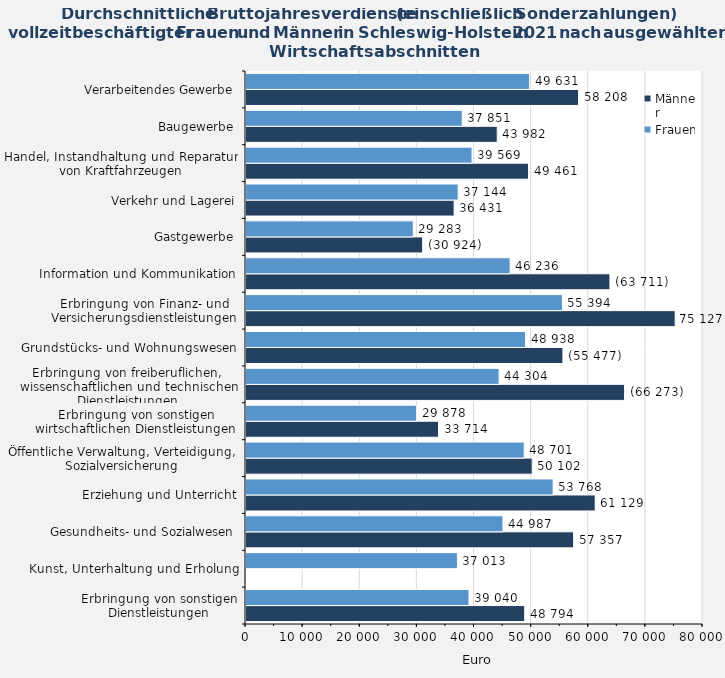
| Category | Männer | Frauen |
|---|---|---|
| Erbringung von sonstigen Dienstleistungen | 48794 | 39040 |
| Kunst, Unterhaltung und Erholung | 0 | 37013 |
| Gesundheits- und Sozialwesen | 57357 | 44987 |
| Erziehung und Unterricht | 61129 | 53768 |
| Öffentliche Verwaltung, Verteidigung, Sozialversicherung | 50102 | 48701 |
| Erbringung von sonstigen wirtschaftlichen Dienstleistungen | 33714 | 29878 |
| Erbringung von freiberuflichen, 
wissenschaftlichen und technischen Dienstleistungen | 66273 | 44304 |
| Grundstücks- und Wohnungswesen | 55477 | 48938 |
| Erbringung von Finanz- und Versicherungsdienstleistungen | 75127 | 55394 |
| Information und Kommunikation | 63711 | 46236 |
| Gastgewerbe | 30924 | 29283 |
| Verkehr und Lagerei | 36431 | 37144 |
| Handel, Instandhaltung und Reparatur von Kraftfahrzeugen | 49461 | 39569 |
| Baugewerbe | 43982 | 37851 |
| Verarbeitendes Gewerbe | 58208 | 49631 |